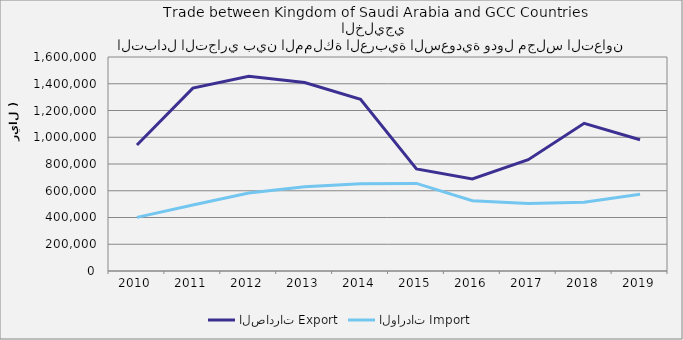
| Category | الصادرات | الواردات |
|---|---|---|
| 2010.0 | 941785072434 | 400735520910 |
| 2011.0 | 1367619830684 | 493449082585 |
| 2012.0 | 1456502163451 | 583473067875 |
| 2013.0 | 1409523296716 | 630582433092 |
| 2014.0 | 1284121545536 | 651875760674 |
| 2015.0 | 763313062522 | 655033363532 |
| 2016.0 | 688423019366 | 525635962804 |
| 2017.0 | 831881287830 | 504446616737 |
| 2018.0 | 1103900485991 | 513992690199 |
| 2019.0 | 981012363319 | 574361454604 |